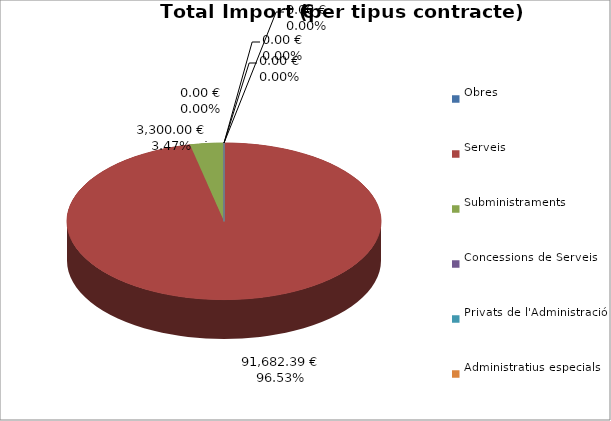
| Category | Total preu
(amb IVA) |
|---|---|
| Obres | 0 |
| Serveis | 91682.39 |
| Subministraments | 3300 |
| Concessions de Serveis | 0 |
| Privats de l'Administració | 0 |
| Administratius especials | 0 |